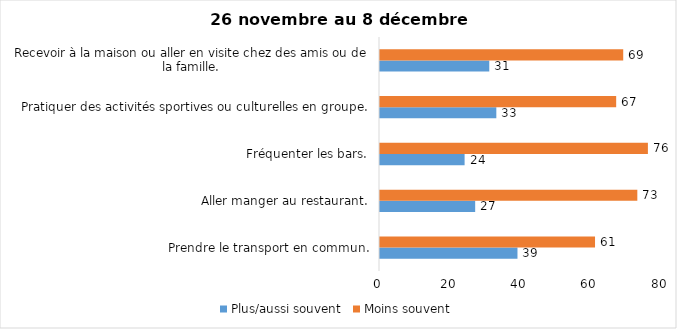
| Category | Plus/aussi souvent | Moins souvent |
|---|---|---|
| Prendre le transport en commun. | 39 | 61 |
| Aller manger au restaurant. | 27 | 73 |
| Fréquenter les bars. | 24 | 76 |
| Pratiquer des activités sportives ou culturelles en groupe. | 33 | 67 |
| Recevoir à la maison ou aller en visite chez des amis ou de la famille. | 31 | 69 |